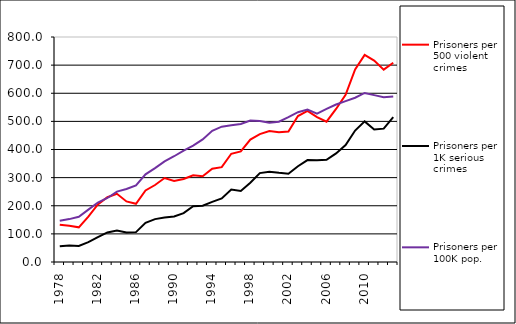
| Category | Prisoners per 500 violent crimes | Prisoners per 1K serious crimes | Prisoners per 100K pop. |
|---|---|---|---|
| 1978.0 | 132.733 | 55.628 | 146.559 |
| 1979.0 | 128.614 | 58.902 | 152.531 |
| 1980.0 | 123.352 | 57.218 | 160.568 |
| 1981.0 | 161.64 | 70.507 | 186.144 |
| 1982.0 | 204.532 | 88.104 | 211.469 |
| 1983.0 | 230.262 | 105.225 | 227.573 |
| 1984.0 | 242.638 | 112.304 | 250.442 |
| 1985.0 | 215.42 | 105.005 | 259.586 |
| 1986.0 | 206.961 | 106.188 | 272.475 |
| 1987.0 | 254.508 | 139.286 | 311.813 |
| 1988.0 | 273.75 | 152.503 | 334.045 |
| 1989.0 | 298.452 | 157.883 | 357.874 |
| 1990.0 | 288.173 | 161.907 | 375.993 |
| 1991.0 | 295.066 | 173.738 | 395.813 |
| 1992.0 | 308.294 | 198.619 | 413.622 |
| 1993.0 | 304.882 | 199.939 | 435.976 |
| 1994.0 | 331.641 | 213.996 | 466.38 |
| 1995.0 | 337.116 | 225.814 | 481.057 |
| 1996.0 | 384.848 | 257.474 | 486.066 |
| 1997.0 | 393.386 | 252.611 | 490.735 |
| 1998.0 | 435.443 | 281.582 | 503.32 |
| 1999.0 | 454.621 | 316.063 | 501.095 |
| 2000.0 | 465.745 | 320.927 | 495.3 |
| 2001.0 | 461.43 | 316.937 | 498.646 |
| 2002.0 | 464.154 | 313.787 | 514.746 |
| 2003.0 | 518.926 | 340.649 | 532.727 |
| 2004.0 | 537.2 | 362.385 | 541.928 |
| 2005.0 | 515.306 | 361.853 | 527.649 |
| 2006.0 | 498.929 | 363.183 | 544.198 |
| 2007.0 | 544.158 | 386.181 | 559.889 |
| 2008.0 | 594.551 | 415.978 | 572.178 |
| 2009.0 | 684.887 | 467.381 | 584.146 |
| 2010.0 | 736.496 | 499.935 | 601.109 |
| 2011.0 | 716.152 | 470.89 | 593.291 |
| 2012.0 | 683.869 | 474.169 | 586.187 |
| 2013.0 | 708.261 | 514.868 | 588.727 |